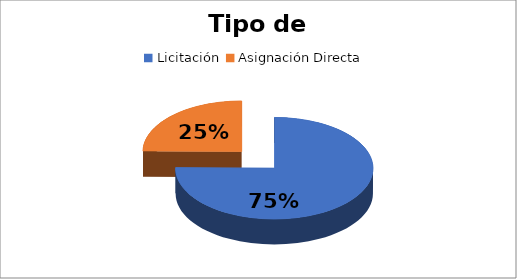
| Category | Suma  |
|---|---|
| Licitación  | 81251823.72 |
| Asignación Directa  | 26832424.61 |